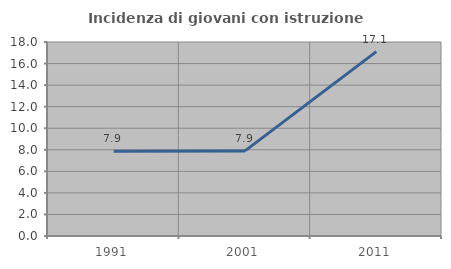
| Category | Incidenza di giovani con istruzione universitaria |
|---|---|
| 1991.0 | 7.867 |
| 2001.0 | 7.895 |
| 2011.0 | 17.108 |